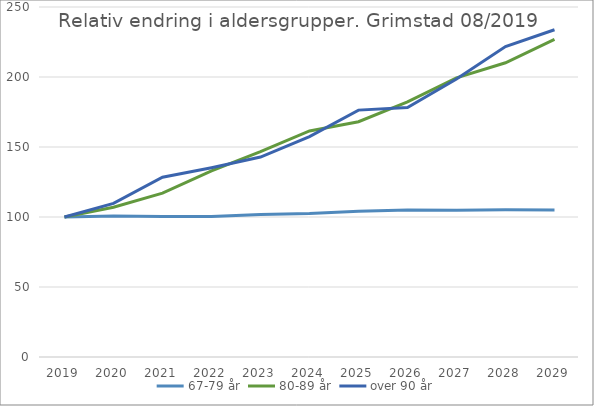
| Category | 67-79 år | 80-89 år | over 90 år |
|---|---|---|---|
| 2019 | 100 | 100 | 100 |
| 2020 | 100.63 | 106.979 | 109.685 |
| 2021 | 100.33 | 117.083 | 128.41 |
| 2022 | 100.35 | 132.981 | 135.228 |
| 2023 | 101.818 | 146.688 | 142.825 |
| 2024 | 102.52 | 161.491 | 157.449 |
| 2025 | 104.106 | 168.061 | 176.338 |
| 2026 | 105.063 | 182.218 | 178.25 |
| 2027 | 104.855 | 199.401 | 198.581 |
| 2028 | 105.177 | 210.147 | 221.742 |
| 2029 | 105.001 | 226.853 | 233.759 |